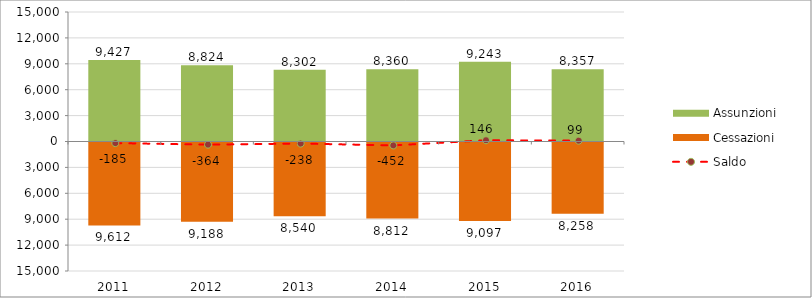
| Category | Assunzioni | Cessazioni |
|---|---|---|
| 2011.0 | 9427 | -9612 |
| 2012.0 | 8824 | -9188 |
| 2013.0 | 8302 | -8540 |
| 2014.0 | 8360 | -8812 |
| 2015.0 | 9243 | -9097 |
| 2016.0 | 8357 | -8258 |